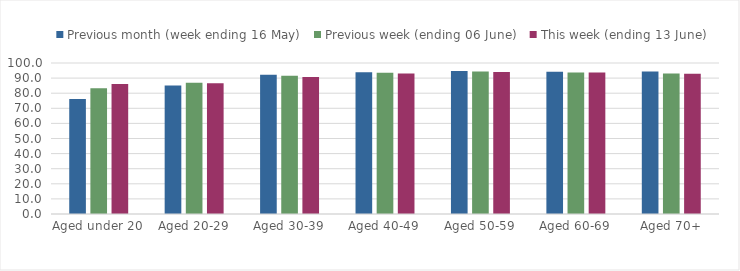
| Category | Previous month (week ending 16 May) | Previous week (ending 06 June) | This week (ending 13 June) |
|---|---|---|---|
| Aged under 20 | 76.204 | 83.273 | 86.055 |
| Aged 20-29 | 85.101 | 86.922 | 86.598 |
| Aged 30-39 | 92.194 | 91.6 | 90.803 |
| Aged 40-49 | 93.884 | 93.498 | 93.125 |
| Aged 50-59 | 94.683 | 94.308 | 94.093 |
| Aged 60-69 | 94.157 | 93.73 | 93.71 |
| Aged 70+ | 94.345 | 92.971 | 92.941 |